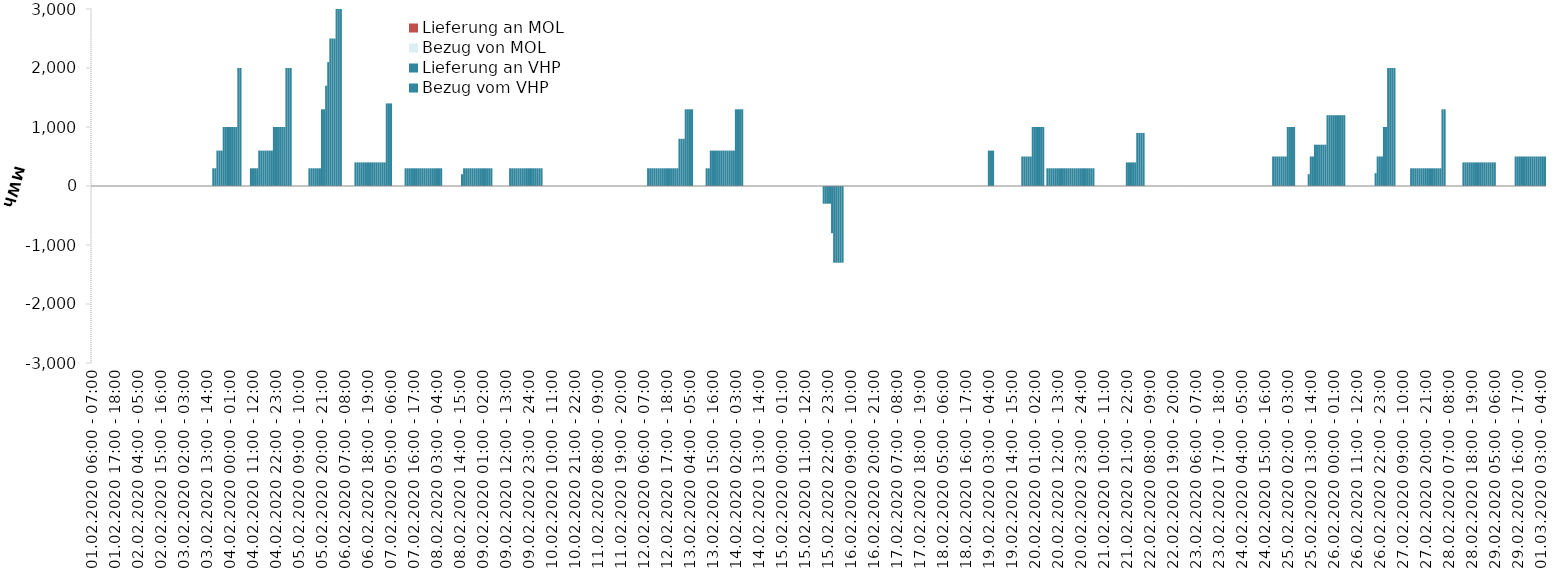
| Category | Bezug vom VHP | Lieferung an VHP | Bezug von MOL | Lieferung an MOL |
|---|---|---|---|---|
| 01.02.2020 06:00 - 07:00 | 0 | 0 | 0 | 0 |
| 01.02.2020 07:00 - 08:00 | 0 | 0 | 0 | 0 |
| 01.02.2020 08:00 - 09:00 | 0 | 0 | 0 | 0 |
| 01.02.2020 09:00 - 10:00 | 0 | 0 | 0 | 0 |
| 01.02.2020 10:00 - 11:00 | 0 | 0 | 0 | 0 |
| 01.02.2020 11:00 - 12:00 | 0 | 0 | 0 | 0 |
| 01.02.2020 12:00 - 13:00 | 0 | 0 | 0 | 0 |
| 01.02.2020 13:00 - 14:00 | 0 | 0 | 0 | 0 |
| 01.02.2020 14:00 - 15:00 | 0 | 0 | 0 | 0 |
| 01.02.2020 15:00 - 16:00 | 0 | 0 | 0 | 0 |
| 01.02.2020 16:00 - 17:00 | 0 | 0 | 0 | 0 |
| 01.02.2020 17:00 - 18:00 | 0 | 0 | 0 | 0 |
| 01.02.2020 18:00 - 19:00 | 0 | 0 | 0 | 0 |
| 01.02.2020 19:00 - 20:00 | 0 | 0 | 0 | 0 |
| 01.02.2020 20:00 - 21:00 | 0 | 0 | 0 | 0 |
| 01.02.2020 21:00 - 22:00 | 0 | 0 | 0 | 0 |
| 01.02.2020 22:00 - 23:00 | 0 | 0 | 0 | 0 |
| 01.02.2020 23:00 - 24:00 | 0 | 0 | 0 | 0 |
| 02.02.2020 00:00 - 01:00 | 0 | 0 | 0 | 0 |
| 02.02.2020 01:00 - 02:00 | 0 | 0 | 0 | 0 |
| 02.02.2020 02:00 - 03:00 | 0 | 0 | 0 | 0 |
| 02.02.2020 03:00 - 04:00 | 0 | 0 | 0 | 0 |
| 02.02.2020 04:00 - 05:00 | 0 | 0 | 0 | 0 |
| 02.02.2020 05:00 - 06:00 | 0 | 0 | 0 | 0 |
| 02.02.2020 06:00 - 07:00 | 0 | 0 | 0 | 0 |
| 02.02.2020 07:00 - 08:00 | 0 | 0 | 0 | 0 |
| 02.02.2020 08:00 - 09:00 | 0 | 0 | 0 | 0 |
| 02.02.2020 09:00 - 10:00 | 0 | 0 | 0 | 0 |
| 02.02.2020 10:00 - 11:00 | 0 | 0 | 0 | 0 |
| 02.02.2020 11:00 - 12:00 | 0 | 0 | 0 | 0 |
| 02.02.2020 12:00 - 13:00 | 0 | 0 | 0 | 0 |
| 02.02.2020 13:00 - 14:00 | 0 | 0 | 0 | 0 |
| 02.02.2020 14:00 - 15:00 | 0 | 0 | 0 | 0 |
| 02.02.2020 15:00 - 16:00 | 0 | 0 | 0 | 0 |
| 02.02.2020 16:00 - 17:00 | 0 | 0 | 0 | 0 |
| 02.02.2020 17:00 - 18:00 | 0 | 0 | 0 | 0 |
| 02.02.2020 18:00 - 19:00 | 0 | 0 | 0 | 0 |
| 02.02.2020 19:00 - 20:00 | 0 | 0 | 0 | 0 |
| 02.02.2020 20:00 - 21:00 | 0 | 0 | 0 | 0 |
| 02.02.2020 21:00 - 22:00 | 0 | 0 | 0 | 0 |
| 02.02.2020 22:00 - 23:00 | 0 | 0 | 0 | 0 |
| 02.02.2020 23:00 - 24:00 | 0 | 0 | 0 | 0 |
| 03.02.2020 00:00 - 01:00 | 0 | 0 | 0 | 0 |
| 03.02.2020 01:00 - 02:00 | 0 | 0 | 0 | 0 |
| 03.02.2020 02:00 - 03:00 | 0 | 0 | 0 | 0 |
| 03.02.2020 03:00 - 04:00 | 0 | 0 | 0 | 0 |
| 03.02.2020 04:00 - 05:00 | 0 | 0 | 0 | 0 |
| 03.02.2020 05:00 - 06:00 | 0 | 0 | 0 | 0 |
| 03.02.2020 06:00 - 07:00 | 0 | 0 | 0 | 0 |
| 03.02.2020 07:00 - 08:00 | 0 | 0 | 0 | 0 |
| 03.02.2020 08:00 - 09:00 | 0 | 0 | 0 | 0 |
| 03.02.2020 09:00 - 10:00 | 0 | 0 | 0 | 0 |
| 03.02.2020 10:00 - 11:00 | 0 | 0 | 0 | 0 |
| 03.02.2020 11:00 - 12:00 | 0 | 0 | 0 | 0 |
| 03.02.2020 12:00 - 13:00 | 0 | 0 | 0 | 0 |
| 03.02.2020 13:00 - 14:00 | 0 | 0 | 0 | 0 |
| 03.02.2020 14:00 - 15:00 | 0 | 0 | 0 | 0 |
| 03.02.2020 15:00 - 16:00 | 0 | 0 | 0 | 0 |
| 03.02.2020 16:00 - 17:00 | 300 | 0 | 0 | 0 |
| 03.02.2020 17:00 - 18:00 | 300 | 0 | 0 | 0 |
| 03.02.2020 18:00 - 19:00 | 600 | 0 | 0 | 0 |
| 03.02.2020 19:00 - 20:00 | 600 | 0 | 0 | 0 |
| 03.02.2020 20:00 - 21:00 | 600 | 0 | 0 | 0 |
| 03.02.2020 21:00 - 22:00 | 1000 | 0 | 0 | 0 |
| 03.02.2020 22:00 - 23:00 | 1000 | 0 | 0 | 0 |
| 03.02.2020 23:00 - 24:00 | 1000 | 0 | 0 | 0 |
| 04.02.2020 00:00 - 01:00 | 1000 | 0 | 0 | 0 |
| 04.02.2020 01:00 - 02:00 | 1000 | 0 | 0 | 0 |
| 04.02.2020 02:00 - 03:00 | 1000 | 0 | 0 | 0 |
| 04.02.2020 03:00 - 04:00 | 1000 | 0 | 0 | 0 |
| 04.02.2020 04:00 - 05:00 | 2000 | 0 | 0 | 0 |
| 04.02.2020 05:00 - 06:00 | 2000 | 0 | 0 | 0 |
| 04.02.2020 06:00 - 07:00 | 0 | 0 | 0 | 0 |
| 04.02.2020 07:00 - 08:00 | 0 | 0 | 0 | 0 |
| 04.02.2020 08:00 - 09:00 | 0 | 0 | 0 | 0 |
| 04.02.2020 09:00 - 10:00 | 0 | 0 | 0 | 0 |
| 04.02.2020 10:00 - 11:00 | 300 | 0 | 0 | 0 |
| 04.02.2020 11:00 - 12:00 | 300 | 0 | 0 | 0 |
| 04.02.2020 12:00 - 13:00 | 300 | 0 | 0 | 0 |
| 04.02.2020 13:00 - 14:00 | 300 | 0 | 0 | 0 |
| 04.02.2020 14:00 - 15:00 | 600 | 0 | 0 | 0 |
| 04.02.2020 15:00 - 16:00 | 600 | 0 | 0 | 0 |
| 04.02.2020 16:00 - 17:00 | 600 | 0 | 0 | 0 |
| 04.02.2020 17:00 - 18:00 | 600 | 0 | 0 | 0 |
| 04.02.2020 18:00 - 19:00 | 600 | 0 | 0 | 0 |
| 04.02.2020 19:00 - 20:00 | 600 | 0 | 0 | 0 |
| 04.02.2020 20:00 - 21:00 | 600 | 0 | 0 | 0 |
| 04.02.2020 21:00 - 22:00 | 1000 | 0 | 0 | 0 |
| 04.02.2020 22:00 - 23:00 | 1000 | 0 | 0 | 0 |
| 04.02.2020 23:00 - 24:00 | 1000 | 0 | 0 | 0 |
| 05.02.2020 00:00 - 01:00 | 1000 | 0 | 0 | 0 |
| 05.02.2020 01:00 - 02:00 | 1000 | 0 | 0 | 0 |
| 05.02.2020 02:00 - 03:00 | 1000 | 0 | 0 | 0 |
| 05.02.2020 03:00 - 04:00 | 2000 | 0 | 0 | 0 |
| 05.02.2020 04:00 - 05:00 | 2000 | 0 | 0 | 0 |
| 05.02.2020 05:00 - 06:00 | 2000 | 0 | 0 | 0 |
| 05.02.2020 06:00 - 07:00 | 0 | 0 | 0 | 0 |
| 05.02.2020 07:00 - 08:00 | 0 | 0 | 0 | 0 |
| 05.02.2020 08:00 - 09:00 | 0 | 0 | 0 | 0 |
| 05.02.2020 09:00 - 10:00 | 0 | 0 | 0 | 0 |
| 05.02.2020 10:00 - 11:00 | 0 | 0 | 0 | 0 |
| 05.02.2020 11:00 - 12:00 | 0 | 0 | 0 | 0 |
| 05.02.2020 12:00 - 13:00 | 0 | 0 | 0 | 0 |
| 05.02.2020 13:00 - 14:00 | 0 | 0 | 0 | 0 |
| 05.02.2020 14:00 - 15:00 | 300 | 0 | 0 | 0 |
| 05.02.2020 15:00 - 16:00 | 300 | 0 | 0 | 0 |
| 05.02.2020 16:00 - 17:00 | 300 | 0 | 0 | 0 |
| 05.02.2020 17:00 - 18:00 | 300 | 0 | 0 | 0 |
| 05.02.2020 18:00 - 19:00 | 300 | 0 | 0 | 0 |
| 05.02.2020 19:00 - 20:00 | 300 | 0 | 0 | 0 |
| 05.02.2020 20:00 - 21:00 | 1300 | 0 | 0 | 0 |
| 05.02.2020 21:00 - 22:00 | 1300 | 0 | 0 | 0 |
| 05.02.2020 22:00 - 23:00 | 1700 | 0 | 0 | 0 |
| 05.02.2020 23:00 - 24:00 | 2100 | 0 | 0 | 0 |
| 06.02.2020 00:00 - 01:00 | 2500 | 0 | 0 | 0 |
| 06.02.2020 01:00 - 02:00 | 2500 | 0 | 0 | 0 |
| 06.02.2020 02:00 - 03:00 | 2500 | 0 | 0 | 0 |
| 06.02.2020 03:00 - 04:00 | 3500 | 0 | 0 | 0 |
| 06.02.2020 04:00 - 05:00 | 3500 | 0 | 0 | 0 |
| 06.02.2020 05:00 - 06:00 | 3500 | 0 | 0 | 0 |
| 06.02.2020 06:00 - 07:00 | 0 | 0 | 0 | 0 |
| 06.02.2020 07:00 - 08:00 | 0 | 0 | 0 | 0 |
| 06.02.2020 08:00 - 09:00 | 0 | 0 | 0 | 0 |
| 06.02.2020 09:00 - 10:00 | 0 | 0 | 0 | 0 |
| 06.02.2020 10:00 - 11:00 | 0 | 0 | 0 | 0 |
| 06.02.2020 11:00 - 12:00 | 0 | 0 | 0 | 0 |
| 06.02.2020 12:00 - 13:00 | 400 | 0 | 0 | 0 |
| 06.02.2020 13:00 - 14:00 | 400 | 0 | 0 | 0 |
| 06.02.2020 14:00 - 15:00 | 400 | 0 | 0 | 0 |
| 06.02.2020 15:00 - 16:00 | 400 | 0 | 0 | 0 |
| 06.02.2020 16:00 - 17:00 | 400 | 0 | 0 | 0 |
| 06.02.2020 17:00 - 18:00 | 400 | 0 | 0 | 0 |
| 06.02.2020 18:00 - 19:00 | 400 | 0 | 0 | 0 |
| 06.02.2020 19:00 - 20:00 | 400 | 0 | 0 | 0 |
| 06.02.2020 20:00 - 21:00 | 400 | 0 | 0 | 0 |
| 06.02.2020 21:00 - 22:00 | 400 | 0 | 0 | 0 |
| 06.02.2020 22:00 - 23:00 | 400 | 0 | 0 | 0 |
| 06.02.2020 23:00 - 24:00 | 400 | 0 | 0 | 0 |
| 07.02.2020 00:00 - 01:00 | 400 | 0 | 0 | 0 |
| 07.02.2020 01:00 - 02:00 | 400 | 0 | 0 | 0 |
| 07.02.2020 02:00 - 03:00 | 400 | 0 | 0 | 0 |
| 07.02.2020 03:00 - 04:00 | 1400 | 0 | 0 | 0 |
| 07.02.2020 04:00 - 05:00 | 1400 | 0 | 0 | 0 |
| 07.02.2020 05:00 - 06:00 | 1400 | 0 | 0 | 0 |
| 07.02.2020 06:00 - 07:00 | 0 | 0 | 0 | 0 |
| 07.02.2020 07:00 - 08:00 | 0 | 0 | 0 | 0 |
| 07.02.2020 08:00 - 09:00 | 0 | 0 | 0 | 0 |
| 07.02.2020 09:00 - 10:00 | 0 | 0 | 0 | 0 |
| 07.02.2020 10:00 - 11:00 | 0 | 0 | 0 | 0 |
| 07.02.2020 11:00 - 12:00 | 0 | 0 | 0 | 0 |
| 07.02.2020 12:00 - 13:00 | 300 | 0 | 0 | 0 |
| 07.02.2020 13:00 - 14:00 | 300 | 0 | 0 | 0 |
| 07.02.2020 14:00 - 15:00 | 300 | 0 | 0 | 0 |
| 07.02.2020 15:00 - 16:00 | 300 | 0 | 0 | 0 |
| 07.02.2020 16:00 - 17:00 | 300 | 0 | 0 | 0 |
| 07.02.2020 17:00 - 18:00 | 300 | 0 | 0 | 0 |
| 07.02.2020 18:00 - 19:00 | 300 | 0 | 0 | 0 |
| 07.02.2020 19:00 - 20:00 | 300 | 0 | 0 | 0 |
| 07.02.2020 20:00 - 21:00 | 300 | 0 | 0 | 0 |
| 07.02.2020 21:00 - 22:00 | 300 | 0 | 0 | 0 |
| 07.02.2020 22:00 - 23:00 | 300 | 0 | 0 | 0 |
| 07.02.2020 23:00 - 24:00 | 300 | 0 | 0 | 0 |
| 08.02.2020 00:00 - 01:00 | 300 | 0 | 0 | 0 |
| 08.02.2020 01:00 - 02:00 | 300 | 0 | 0 | 0 |
| 08.02.2020 02:00 - 03:00 | 300 | 0 | 0 | 0 |
| 08.02.2020 03:00 - 04:00 | 300 | 0 | 0 | 0 |
| 08.02.2020 04:00 - 05:00 | 300 | 0 | 0 | 0 |
| 08.02.2020 05:00 - 06:00 | 300 | 0 | 0 | 0 |
| 08.02.2020 06:00 - 07:00 | 0 | 0 | 0 | 0 |
| 08.02.2020 07:00 - 08:00 | 0 | 0 | 0 | 0 |
| 08.02.2020 08:00 - 09:00 | 0 | 0 | 0 | 0 |
| 08.02.2020 09:00 - 10:00 | 0 | 0 | 0 | 0 |
| 08.02.2020 10:00 - 11:00 | 0 | 0 | 0 | 0 |
| 08.02.2020 11:00 - 12:00 | 0 | 0 | 0 | 0 |
| 08.02.2020 12:00 - 13:00 | 0 | 0 | 0 | 0 |
| 08.02.2020 13:00 - 14:00 | 0 | 0 | 0 | 0 |
| 08.02.2020 14:00 - 15:00 | 0 | 0 | 0 | 0 |
| 08.02.2020 15:00 - 16:00 | 200 | 0 | 0 | 0 |
| 08.02.2020 16:00 - 17:00 | 300 | 0 | 0 | 0 |
| 08.02.2020 17:00 - 18:00 | 300 | 0 | 0 | 0 |
| 08.02.2020 18:00 - 19:00 | 300 | 0 | 0 | 0 |
| 08.02.2020 19:00 - 20:00 | 300 | 0 | 0 | 0 |
| 08.02.2020 20:00 - 21:00 | 300 | 0 | 0 | 0 |
| 08.02.2020 21:00 - 22:00 | 300 | 0 | 0 | 0 |
| 08.02.2020 22:00 - 23:00 | 300 | 0 | 0 | 0 |
| 08.02.2020 23:00 - 24:00 | 300 | 0 | 0 | 0 |
| 09.02.2020 00:00 - 01:00 | 300 | 0 | 0 | 0 |
| 09.02.2020 01:00 - 02:00 | 300 | 0 | 0 | 0 |
| 09.02.2020 02:00 - 03:00 | 300 | 0 | 0 | 0 |
| 09.02.2020 03:00 - 04:00 | 300 | 0 | 0 | 0 |
| 09.02.2020 04:00 - 05:00 | 300 | 0 | 0 | 0 |
| 09.02.2020 05:00 - 06:00 | 300 | 0 | 0 | 0 |
| 09.02.2020 06:00 - 07:00 | 0 | 0 | 0 | 0 |
| 09.02.2020 07:00 - 08:00 | 0 | 0 | 0 | 0 |
| 09.02.2020 08:00 - 09:00 | 0 | 0 | 0 | 0 |
| 09.02.2020 09:00 - 10:00 | 0 | 0 | 0 | 0 |
| 09.02.2020 10:00 - 11:00 | 0 | 0 | 0 | 0 |
| 09.02.2020 11:00 - 12:00 | 0 | 0 | 0 | 0 |
| 09.02.2020 12:00 - 13:00 | 0 | 0 | 0 | 0 |
| 09.02.2020 13:00 - 14:00 | 0 | 0 | 0 | 0 |
| 09.02.2020 14:00 - 15:00 | 300 | 0 | 0 | 0 |
| 09.02.2020 15:00 - 16:00 | 300 | 0 | 0 | 0 |
| 09.02.2020 16:00 - 17:00 | 300 | 0 | 0 | 0 |
| 09.02.2020 17:00 - 18:00 | 300 | 0 | 0 | 0 |
| 09.02.2020 18:00 - 19:00 | 300 | 0 | 0 | 0 |
| 09.02.2020 19:00 - 20:00 | 300 | 0 | 0 | 0 |
| 09.02.2020 20:00 - 21:00 | 300 | 0 | 0 | 0 |
| 09.02.2020 21:00 - 22:00 | 300 | 0 | 0 | 0 |
| 09.02.2020 22:00 - 23:00 | 300 | 0 | 0 | 0 |
| 09.02.2020 23:00 - 24:00 | 300 | 0 | 0 | 0 |
| 10.02.2020 00:00 - 01:00 | 300 | 0 | 0 | 0 |
| 10.02.2020 01:00 - 02:00 | 300 | 0 | 0 | 0 |
| 10.02.2020 02:00 - 03:00 | 300 | 0 | 0 | 0 |
| 10.02.2020 03:00 - 04:00 | 300 | 0 | 0 | 0 |
| 10.02.2020 04:00 - 05:00 | 300 | 0 | 0 | 0 |
| 10.02.2020 05:00 - 06:00 | 300 | 0 | 0 | 0 |
| 10.02.2020 06:00 - 07:00 | 0 | 0 | 0 | 0 |
| 10.02.2020 07:00 - 08:00 | 0 | 0 | 0 | 0 |
| 10.02.2020 08:00 - 09:00 | 0 | 0 | 0 | 0 |
| 10.02.2020 09:00 - 10:00 | 0 | 0 | 0 | 0 |
| 10.02.2020 10:00 - 11:00 | 0 | 0 | 0 | 0 |
| 10.02.2020 11:00 - 12:00 | 0 | 0 | 0 | 0 |
| 10.02.2020 12:00 - 13:00 | 0 | 0 | 0 | 0 |
| 10.02.2020 13:00 - 14:00 | 0 | 0 | 0 | 0 |
| 10.02.2020 14:00 - 15:00 | 0 | 0 | 0 | 0 |
| 10.02.2020 15:00 - 16:00 | 0 | 0 | 0 | 0 |
| 10.02.2020 16:00 - 17:00 | 0 | 0 | 0 | 0 |
| 10.02.2020 17:00 - 18:00 | 0 | 0 | 0 | 0 |
| 10.02.2020 18:00 - 19:00 | 0 | 0 | 0 | 0 |
| 10.02.2020 19:00 - 20:00 | 0 | 0 | 0 | 0 |
| 10.02.2020 20:00 - 21:00 | 0 | 0 | 0 | 0 |
| 10.02.2020 21:00 - 22:00 | 0 | 0 | 0 | 0 |
| 10.02.2020 22:00 - 23:00 | 0 | 0 | 0 | 0 |
| 10.02.2020 23:00 - 24:00 | 0 | 0 | 0 | 0 |
| 11.02.2020 00:00 - 01:00 | 0 | 0 | 0 | 0 |
| 11.02.2020 01:00 - 02:00 | 0 | 0 | 0 | 0 |
| 11.02.2020 02:00 - 03:00 | 0 | 0 | 0 | 0 |
| 11.02.2020 03:00 - 04:00 | 0 | 0 | 0 | 0 |
| 11.02.2020 04:00 - 05:00 | 0 | 0 | 0 | 0 |
| 11.02.2020 05:00 - 06:00 | 0 | 0 | 0 | 0 |
| 11.02.2020 06:00 - 07:00 | 0 | 0 | 0 | 0 |
| 11.02.2020 07:00 - 08:00 | 0 | 0 | 0 | 0 |
| 11.02.2020 08:00 - 09:00 | 0 | 0 | 0 | 0 |
| 11.02.2020 09:00 - 10:00 | 0 | 0 | 0 | 0 |
| 11.02.2020 10:00 - 11:00 | 0 | 0 | 0 | 0 |
| 11.02.2020 11:00 - 12:00 | 0 | 0 | 0 | 0 |
| 11.02.2020 12:00 - 13:00 | 0 | 0 | 0 | 0 |
| 11.02.2020 13:00 - 14:00 | 0 | 0 | 0 | 0 |
| 11.02.2020 14:00 - 15:00 | 0 | 0 | 0 | 0 |
| 11.02.2020 15:00 - 16:00 | 0 | 0 | 0 | 0 |
| 11.02.2020 16:00 - 17:00 | 0 | 0 | 0 | 0 |
| 11.02.2020 17:00 - 18:00 | 0 | 0 | 0 | 0 |
| 11.02.2020 18:00 - 19:00 | 0 | 0 | 0 | 0 |
| 11.02.2020 19:00 - 20:00 | 0 | 0 | 0 | 0 |
| 11.02.2020 20:00 - 21:00 | 0 | 0 | 0 | 0 |
| 11.02.2020 21:00 - 22:00 | 0 | 0 | 0 | 0 |
| 11.02.2020 22:00 - 23:00 | 0 | 0 | 0 | 0 |
| 11.02.2020 23:00 - 24:00 | 0 | 0 | 0 | 0 |
| 12.02.2020 00:00 - 01:00 | 0 | 0 | 0 | 0 |
| 12.02.2020 01:00 - 02:00 | 0 | 0 | 0 | 0 |
| 12.02.2020 02:00 - 03:00 | 0 | 0 | 0 | 0 |
| 12.02.2020 03:00 - 04:00 | 0 | 0 | 0 | 0 |
| 12.02.2020 04:00 - 05:00 | 0 | 0 | 0 | 0 |
| 12.02.2020 05:00 - 06:00 | 0 | 0 | 0 | 0 |
| 12.02.2020 06:00 - 07:00 | 0 | 0 | 0 | 0 |
| 12.02.2020 07:00 - 08:00 | 0 | 0 | 0 | 0 |
| 12.02.2020 08:00 - 09:00 | 300 | 0 | 0 | 0 |
| 12.02.2020 09:00 - 10:00 | 300 | 0 | 0 | 0 |
| 12.02.2020 10:00 - 11:00 | 300 | 0 | 0 | 0 |
| 12.02.2020 11:00 - 12:00 | 300 | 0 | 0 | 0 |
| 12.02.2020 12:00 - 13:00 | 300 | 0 | 0 | 0 |
| 12.02.2020 13:00 - 14:00 | 300 | 0 | 0 | 0 |
| 12.02.2020 14:00 - 15:00 | 300 | 0 | 0 | 0 |
| 12.02.2020 15:00 - 16:00 | 300 | 0 | 0 | 0 |
| 12.02.2020 16:00 - 17:00 | 300 | 0 | 0 | 0 |
| 12.02.2020 17:00 - 18:00 | 300 | 0 | 0 | 0 |
| 12.02.2020 18:00 - 19:00 | 300 | 0 | 0 | 0 |
| 12.02.2020 19:00 - 20:00 | 300 | 0 | 0 | 0 |
| 12.02.2020 20:00 - 21:00 | 300 | 0 | 0 | 0 |
| 12.02.2020 21:00 - 22:00 | 300 | 0 | 0 | 0 |
| 12.02.2020 22:00 - 23:00 | 300 | 0 | 0 | 0 |
| 12.02.2020 23:00 - 24:00 | 800 | 0 | 0 | 0 |
| 13.02.2020 00:00 - 01:00 | 800 | 0 | 0 | 0 |
| 13.02.2020 01:00 - 02:00 | 800 | 0 | 0 | 0 |
| 13.02.2020 02:00 - 03:00 | 1300 | 0 | 0 | 0 |
| 13.02.2020 03:00 - 04:00 | 1300 | 0 | 0 | 0 |
| 13.02.2020 04:00 - 05:00 | 1300 | 0 | 0 | 0 |
| 13.02.2020 05:00 - 06:00 | 1300 | 0 | 0 | 0 |
| 13.02.2020 06:00 - 07:00 | 0 | 0 | 0 | 0 |
| 13.02.2020 07:00 - 08:00 | 0 | 0 | 0 | 0 |
| 13.02.2020 08:00 - 09:00 | 0 | 0 | 0 | 0 |
| 13.02.2020 09:00 - 10:00 | 0 | 0 | 0 | 0 |
| 13.02.2020 10:00 - 11:00 | 0 | 0 | 0 | 0 |
| 13.02.2020 11:00 - 12:00 | 0 | 0 | 0 | 0 |
| 13.02.2020 12:00 - 13:00 | 300 | 0 | 0 | 0 |
| 13.02.2020 13:00 - 14:00 | 300 | 0 | 0 | 0 |
| 13.02.2020 14:00 - 15:00 | 600 | 0 | 0 | 0 |
| 13.02.2020 15:00 - 16:00 | 600 | 0 | 0 | 0 |
| 13.02.2020 16:00 - 17:00 | 600 | 0 | 0 | 0 |
| 13.02.2020 17:00 - 18:00 | 600 | 0 | 0 | 0 |
| 13.02.2020 18:00 - 19:00 | 600 | 0 | 0 | 0 |
| 13.02.2020 19:00 - 20:00 | 600 | 0 | 0 | 0 |
| 13.02.2020 20:00 - 21:00 | 600 | 0 | 0 | 0 |
| 13.02.2020 21:00 - 22:00 | 600 | 0 | 0 | 0 |
| 13.02.2020 22:00 - 23:00 | 600 | 0 | 0 | 0 |
| 13.02.2020 23:00 - 24:00 | 600 | 0 | 0 | 0 |
| 14.02.2020 00:00 - 01:00 | 600 | 0 | 0 | 0 |
| 14.02.2020 01:00 - 02:00 | 600 | 0 | 0 | 0 |
| 14.02.2020 02:00 - 03:00 | 1300 | 0 | 0 | 0 |
| 14.02.2020 03:00 - 04:00 | 1300 | 0 | 0 | 0 |
| 14.02.2020 04:00 - 05:00 | 1300 | 0 | 0 | 0 |
| 14.02.2020 05:00 - 06:00 | 1300 | 0 | 0 | 0 |
| 14.02.2020 06:00 - 07:00 | 0 | 0 | 0 | 0 |
| 14.02.2020 07:00 - 08:00 | 0 | 0 | 0 | 0 |
| 14.02.2020 08:00 - 09:00 | 0 | 0 | 0 | 0 |
| 14.02.2020 09:00 - 10:00 | 0 | 0 | 0 | 0 |
| 14.02.2020 10:00 - 11:00 | 0 | 0 | 0 | 0 |
| 14.02.2020 11:00 - 12:00 | 0 | 0 | 0 | 0 |
| 14.02.2020 12:00 - 13:00 | 0 | 0 | 0 | 0 |
| 14.02.2020 13:00 - 14:00 | 0 | 0 | 0 | 0 |
| 14.02.2020 14:00 - 15:00 | 0 | 0 | 0 | 0 |
| 14.02.2020 15:00 - 16:00 | 0 | 0 | 0 | 0 |
| 14.02.2020 16:00 - 17:00 | 0 | 0 | 0 | 0 |
| 14.02.2020 17:00 - 18:00 | 0 | 0 | 0 | 0 |
| 14.02.2020 18:00 - 19:00 | 0 | 0 | 0 | 0 |
| 14.02.2020 19:00 - 20:00 | 0 | 0 | 0 | 0 |
| 14.02.2020 20:00 - 21:00 | 0 | 0 | 0 | 0 |
| 14.02.2020 21:00 - 22:00 | 0 | 0 | 0 | 0 |
| 14.02.2020 22:00 - 23:00 | 0 | 0 | 0 | 0 |
| 14.02.2020 23:00 - 24:00 | 0 | 0 | 0 | 0 |
| 15.02.2020 00:00 - 01:00 | 0 | 0 | 0 | 0 |
| 15.02.2020 01:00 - 02:00 | 0 | 0 | 0 | 0 |
| 15.02.2020 02:00 - 03:00 | 0 | 0 | 0 | 0 |
| 15.02.2020 03:00 - 04:00 | 0 | 0 | 0 | 0 |
| 15.02.2020 04:00 - 05:00 | 0 | 0 | 0 | 0 |
| 15.02.2020 05:00 - 06:00 | 0 | 0 | 0 | 0 |
| 15.02.2020 06:00 - 07:00 | 0 | 0 | 0 | 0 |
| 15.02.2020 07:00 - 08:00 | 0 | 0 | 0 | 0 |
| 15.02.2020 08:00 - 09:00 | 0 | 0 | 0 | 0 |
| 15.02.2020 09:00 - 10:00 | 0 | 0 | 0 | 0 |
| 15.02.2020 10:00 - 11:00 | 0 | 0 | 0 | 0 |
| 15.02.2020 11:00 - 12:00 | 0 | 0 | 0 | 0 |
| 15.02.2020 12:00 - 13:00 | 0 | 0 | 0 | 0 |
| 15.02.2020 13:00 - 14:00 | 0 | 0 | 0 | 0 |
| 15.02.2020 14:00 - 15:00 | 0 | 0 | 0 | 0 |
| 15.02.2020 15:00 - 16:00 | 0 | 0 | 0 | 0 |
| 15.02.2020 16:00 - 17:00 | 0 | 0 | 0 | 0 |
| 15.02.2020 17:00 - 18:00 | 0 | 0 | 0 | 0 |
| 15.02.2020 18:00 - 19:00 | 0 | 0 | 0 | 0 |
| 15.02.2020 19:00 - 20:00 | 0 | 0 | 0 | 0 |
| 15.02.2020 20:00 - 21:00 | 0 | -300 | 0 | 0 |
| 15.02.2020 21:00 - 22:00 | 0 | -300 | 0 | 0 |
| 15.02.2020 22:00 - 23:00 | 0 | -300 | 0 | 0 |
| 15.02.2020 23:00 - 24:00 | 0 | -300 | 0 | 0 |
| 16.02.2020 00:00 - 01:00 | 0 | -800 | 0 | 0 |
| 16.02.2020 01:00 - 02:00 | 0 | -1300 | 0 | 0 |
| 16.02.2020 02:00 - 03:00 | 0 | -1300 | 0 | 0 |
| 16.02.2020 03:00 - 04:00 | 0 | -1300 | 0 | 0 |
| 16.02.2020 04:00 - 05:00 | 0 | -1300 | 0 | 0 |
| 16.02.2020 05:00 - 06:00 | 0 | -1300 | 0 | 0 |
| 16.02.2020 06:00 - 07:00 | 0 | 0 | 0 | 0 |
| 16.02.2020 07:00 - 08:00 | 0 | 0 | 0 | 0 |
| 16.02.2020 08:00 - 09:00 | 0 | 0 | 0 | 0 |
| 16.02.2020 09:00 - 10:00 | 0 | 0 | 0 | 0 |
| 16.02.2020 10:00 - 11:00 | 0 | 0 | 0 | 0 |
| 16.02.2020 11:00 - 12:00 | 0 | 0 | 0 | 0 |
| 16.02.2020 12:00 - 13:00 | 0 | 0 | 0 | 0 |
| 16.02.2020 13:00 - 14:00 | 0 | 0 | 0 | 0 |
| 16.02.2020 14:00 - 15:00 | 0 | 0 | 0 | 0 |
| 16.02.2020 15:00 - 16:00 | 0 | 0 | 0 | 0 |
| 16.02.2020 16:00 - 17:00 | 0 | 0 | 0 | 0 |
| 16.02.2020 17:00 - 18:00 | 0 | 0 | 0 | 0 |
| 16.02.2020 18:00 - 19:00 | 0 | 0 | 0 | 0 |
| 16.02.2020 19:00 - 20:00 | 0 | 0 | 0 | 0 |
| 16.02.2020 20:00 - 21:00 | 0 | 0 | 0 | 0 |
| 16.02.2020 21:00 - 22:00 | 0 | 0 | 0 | 0 |
| 16.02.2020 22:00 - 23:00 | 0 | 0 | 0 | 0 |
| 16.02.2020 23:00 - 24:00 | 0 | 0 | 0 | 0 |
| 17.02.2020 00:00 - 01:00 | 0 | 0 | 0 | 0 |
| 17.02.2020 01:00 - 02:00 | 0 | 0 | 0 | 0 |
| 17.02.2020 02:00 - 03:00 | 0 | 0 | 0 | 0 |
| 17.02.2020 03:00 - 04:00 | 0 | 0 | 0 | 0 |
| 17.02.2020 04:00 - 05:00 | 0 | 0 | 0 | 0 |
| 17.02.2020 05:00 - 06:00 | 0 | 0 | 0 | 0 |
| 17.02.2020 06:00 - 07:00 | 0 | 0 | 0 | 0 |
| 17.02.2020 07:00 - 08:00 | 0 | 0 | 0 | 0 |
| 17.02.2020 08:00 - 09:00 | 0 | 0 | 0 | 0 |
| 17.02.2020 09:00 - 10:00 | 0 | 0 | 0 | 0 |
| 17.02.2020 10:00 - 11:00 | 0 | 0 | 0 | 0 |
| 17.02.2020 11:00 - 12:00 | 0 | 0 | 0 | 0 |
| 17.02.2020 12:00 - 13:00 | 0 | 0 | 0 | 0 |
| 17.02.2020 13:00 - 14:00 | 0 | 0 | 0 | 0 |
| 17.02.2020 14:00 - 15:00 | 0 | 0 | 0 | 0 |
| 17.02.2020 15:00 - 16:00 | 0 | 0 | 0 | 0 |
| 17.02.2020 16:00 - 17:00 | 0 | 0 | 0 | 0 |
| 17.02.2020 17:00 - 18:00 | 0 | 0 | 0 | 0 |
| 17.02.2020 18:00 - 19:00 | 0 | 0 | 0 | 0 |
| 17.02.2020 19:00 - 20:00 | 0 | 0 | 0 | 0 |
| 17.02.2020 20:00 - 21:00 | 0 | 0 | 0 | 0 |
| 17.02.2020 21:00 - 22:00 | 0 | 0 | 0 | 0 |
| 17.02.2020 22:00 - 23:00 | 0 | 0 | 0 | 0 |
| 17.02.2020 23:00 - 24:00 | 0 | 0 | 0 | 0 |
| 18.02.2020 00:00 - 01:00 | 0 | 0 | 0 | 0 |
| 18.02.2020 01:00 - 02:00 | 0 | 0 | 0 | 0 |
| 18.02.2020 02:00 - 03:00 | 0 | 0 | 0 | 0 |
| 18.02.2020 03:00 - 04:00 | 0 | 0 | 0 | 0 |
| 18.02.2020 04:00 - 05:00 | 0 | 0 | 0 | 0 |
| 18.02.2020 05:00 - 06:00 | 0 | 0 | 0 | 0 |
| 18.02.2020 06:00 - 07:00 | 0 | 0 | 0 | 0 |
| 18.02.2020 07:00 - 08:00 | 0 | 0 | 0 | 0 |
| 18.02.2020 08:00 - 09:00 | 0 | 0 | 0 | 0 |
| 18.02.2020 09:00 - 10:00 | 0 | 0 | 0 | 0 |
| 18.02.2020 10:00 - 11:00 | 0 | 0 | 0 | 0 |
| 18.02.2020 11:00 - 12:00 | 0 | 0 | 0 | 0 |
| 18.02.2020 12:00 - 13:00 | 0 | 0 | 0 | 0 |
| 18.02.2020 13:00 - 14:00 | 0 | 0 | 0 | 0 |
| 18.02.2020 14:00 - 15:00 | 0 | 0 | 0 | 0 |
| 18.02.2020 15:00 - 16:00 | 0 | 0 | 0 | 0 |
| 18.02.2020 16:00 - 17:00 | 0 | 0 | 0 | 0 |
| 18.02.2020 17:00 - 18:00 | 0 | 0 | 0 | 0 |
| 18.02.2020 18:00 - 19:00 | 0 | 0 | 0 | 0 |
| 18.02.2020 19:00 - 20:00 | 0 | 0 | 0 | 0 |
| 18.02.2020 20:00 - 21:00 | 0 | 0 | 0 | 0 |
| 18.02.2020 21:00 - 22:00 | 0 | 0 | 0 | 0 |
| 18.02.2020 22:00 - 23:00 | 0 | 0 | 0 | 0 |
| 18.02.2020 23:00 - 24:00 | 0 | 0 | 0 | 0 |
| 19.02.2020 00:00 - 01:00 | 0 | 0 | 0 | 0 |
| 19.02.2020 01:00 - 02:00 | 0 | 0 | 0 | 0 |
| 19.02.2020 02:00 - 03:00 | 0 | 0 | 0 | 0 |
| 19.02.2020 03:00 - 04:00 | 600 | 0 | 0 | 0 |
| 19.02.2020 04:00 - 05:00 | 600 | 0 | 0 | 0 |
| 19.02.2020 05:00 - 06:00 | 600 | 0 | 0 | 0 |
| 19.02.2020 06:00 - 07:00 | 0 | 0 | 0 | 0 |
| 19.02.2020 07:00 - 08:00 | 0 | 0 | 0 | 0 |
| 19.02.2020 08:00 - 09:00 | 0 | 0 | 0 | 0 |
| 19.02.2020 09:00 - 10:00 | 0 | 0 | 0 | 0 |
| 19.02.2020 10:00 - 11:00 | 0 | 0 | 0 | 0 |
| 19.02.2020 11:00 - 12:00 | 0 | 0 | 0 | 0 |
| 19.02.2020 12:00 - 13:00 | 0 | 0 | 0 | 0 |
| 19.02.2020 13:00 - 14:00 | 0 | 0 | 0 | 0 |
| 19.02.2020 14:00 - 15:00 | 0 | 0 | 0 | 0 |
| 19.02.2020 15:00 - 16:00 | 0 | 0 | 0 | 0 |
| 19.02.2020 16:00 - 17:00 | 0 | 0 | 0 | 0 |
| 19.02.2020 17:00 - 18:00 | 0 | 0 | 0 | 0 |
| 19.02.2020 18:00 - 19:00 | 0 | 0 | 0 | 0 |
| 19.02.2020 19:00 - 20:00 | 500 | 0 | 0 | 0 |
| 19.02.2020 20:00 - 21:00 | 500 | 0 | 0 | 0 |
| 19.02.2020 21:00 - 22:00 | 500 | 0 | 0 | 0 |
| 19.02.2020 22:00 - 23:00 | 500 | 0 | 0 | 0 |
| 19.02.2020 23:00 - 24:00 | 500 | 0 | 0 | 0 |
| 20.02.2020 00:00 - 01:00 | 1000 | 0 | 0 | 0 |
| 20.02.2020 01:00 - 02:00 | 1000 | 0 | 0 | 0 |
| 20.02.2020 02:00 - 03:00 | 1000 | 0 | 0 | 0 |
| 20.02.2020 03:00 - 04:00 | 1000 | 0 | 0 | 0 |
| 20.02.2020 04:00 - 05:00 | 1000 | 0 | 0 | 0 |
| 20.02.2020 05:00 - 06:00 | 1000 | 0 | 0 | 0 |
| 20.02.2020 06:00 - 07:00 | 0 | 0 | 0 | 0 |
| 20.02.2020 07:00 - 08:00 | 300 | 0 | 0 | 0 |
| 20.02.2020 08:00 - 09:00 | 300 | 0 | 0 | 0 |
| 20.02.2020 09:00 - 10:00 | 300 | 0 | 0 | 0 |
| 20.02.2020 10:00 - 11:00 | 300 | 0 | 0 | 0 |
| 20.02.2020 11:00 - 12:00 | 300 | 0 | 0 | 0 |
| 20.02.2020 12:00 - 13:00 | 300 | 0 | 0 | 0 |
| 20.02.2020 13:00 - 14:00 | 300 | 0 | 0 | 0 |
| 20.02.2020 14:00 - 15:00 | 300 | 0 | 0 | 0 |
| 20.02.2020 15:00 - 16:00 | 300 | 0 | 0 | 0 |
| 20.02.2020 16:00 - 17:00 | 300 | 0 | 0 | 0 |
| 20.02.2020 17:00 - 18:00 | 300 | 0 | 0 | 0 |
| 20.02.2020 18:00 - 19:00 | 300 | 0 | 0 | 0 |
| 20.02.2020 19:00 - 20:00 | 300 | 0 | 0 | 0 |
| 20.02.2020 20:00 - 21:00 | 300 | 0 | 0 | 0 |
| 20.02.2020 21:00 - 22:00 | 300 | 0 | 0 | 0 |
| 20.02.2020 22:00 - 23:00 | 300 | 0 | 0 | 0 |
| 20.02.2020 23:00 - 24:00 | 300 | 0 | 0 | 0 |
| 21.02.2020 00:00 - 01:00 | 300 | 0 | 0 | 0 |
| 21.02.2020 01:00 - 02:00 | 300 | 0 | 0 | 0 |
| 21.02.2020 02:00 - 03:00 | 300 | 0 | 0 | 0 |
| 21.02.2020 03:00 - 04:00 | 300 | 0 | 0 | 0 |
| 21.02.2020 04:00 - 05:00 | 300 | 0 | 0 | 0 |
| 21.02.2020 05:00 - 06:00 | 300 | 0 | 0 | 0 |
| 21.02.2020 06:00 - 07:00 | 0 | 0 | 0 | 0 |
| 21.02.2020 07:00 - 08:00 | 0 | 0 | 0 | 0 |
| 21.02.2020 08:00 - 09:00 | 0 | 0 | 0 | 0 |
| 21.02.2020 09:00 - 10:00 | 0 | 0 | 0 | 0 |
| 21.02.2020 10:00 - 11:00 | 0 | 0 | 0 | 0 |
| 21.02.2020 11:00 - 12:00 | 0 | 0 | 0 | 0 |
| 21.02.2020 12:00 - 13:00 | 0 | 0 | 0 | 0 |
| 21.02.2020 13:00 - 14:00 | 0 | 0 | 0 | 0 |
| 21.02.2020 14:00 - 15:00 | 0 | 0 | 0 | 0 |
| 21.02.2020 15:00 - 16:00 | 0 | 0 | 0 | 0 |
| 21.02.2020 16:00 - 17:00 | 0 | 0 | 0 | 0 |
| 21.02.2020 17:00 - 18:00 | 0 | 0 | 0 | 0 |
| 21.02.2020 18:00 - 19:00 | 0 | 0 | 0 | 0 |
| 21.02.2020 19:00 - 20:00 | 0 | 0 | 0 | 0 |
| 21.02.2020 20:00 - 21:00 | 0 | 0 | 0 | 0 |
| 21.02.2020 21:00 - 22:00 | 400 | 0 | 0 | 0 |
| 21.02.2020 22:00 - 23:00 | 400 | 0 | 0 | 0 |
| 21.02.2020 23:00 - 24:00 | 400 | 0 | 0 | 0 |
| 22.02.2020 00:00 - 01:00 | 400 | 0 | 0 | 0 |
| 22.02.2020 01:00 - 02:00 | 400 | 0 | 0 | 0 |
| 22.02.2020 02:00 - 03:00 | 900 | 0 | 0 | 0 |
| 22.02.2020 03:00 - 04:00 | 900 | 0 | 0 | 0 |
| 22.02.2020 04:00 - 05:00 | 900 | 0 | 0 | 0 |
| 22.02.2020 05:00 - 06:00 | 900 | 0 | 0 | 0 |
| 22.02.2020 06:00 - 07:00 | 0 | 0 | 0 | 0 |
| 22.02.2020 07:00 - 08:00 | 0 | 0 | 0 | 0 |
| 22.02.2020 08:00 - 09:00 | 0 | 0 | 0 | 0 |
| 22.02.2020 09:00 - 10:00 | 0 | 0 | 0 | 0 |
| 22.02.2020 10:00 - 11:00 | 0 | 0 | 0 | 0 |
| 22.02.2020 11:00 - 12:00 | 0 | 0 | 0 | 0 |
| 22.02.2020 12:00 - 13:00 | 0 | 0 | 0 | 0 |
| 22.02.2020 13:00 - 14:00 | 0 | 0 | 0 | 0 |
| 22.02.2020 14:00 - 15:00 | 0 | 0 | 0 | 0 |
| 22.02.2020 15:00 - 16:00 | 0 | 0 | 0 | 0 |
| 22.02.2020 16:00 - 17:00 | 0 | 0 | 0 | 0 |
| 22.02.2020 17:00 - 18:00 | 0 | 0 | 0 | 0 |
| 22.02.2020 18:00 - 19:00 | 0 | 0 | 0 | 0 |
| 22.02.2020 19:00 - 20:00 | 0 | 0 | 0 | 0 |
| 22.02.2020 20:00 - 21:00 | 0 | 0 | 0 | 0 |
| 22.02.2020 21:00 - 22:00 | 0 | 0 | 0 | 0 |
| 22.02.2020 22:00 - 23:00 | 0 | 0 | 0 | 0 |
| 22.02.2020 23:00 - 24:00 | 0 | 0 | 0 | 0 |
| 23.02.2020 00:00 - 01:00 | 0 | 0 | 0 | 0 |
| 23.02.2020 01:00 - 02:00 | 0 | 0 | 0 | 0 |
| 23.02.2020 02:00 - 03:00 | 0 | 0 | 0 | 0 |
| 23.02.2020 03:00 - 04:00 | 0 | 0 | 0 | 0 |
| 23.02.2020 04:00 - 05:00 | 0 | 0 | 0 | 0 |
| 23.02.2020 05:00 - 06:00 | 0 | 0 | 0 | 0 |
| 23.02.2020 06:00 - 07:00 | 0 | 0 | 0 | 0 |
| 23.02.2020 07:00 - 08:00 | 0 | 0 | 0 | 0 |
| 23.02.2020 08:00 - 09:00 | 0 | 0 | 0 | 0 |
| 23.02.2020 09:00 - 10:00 | 0 | 0 | 0 | 0 |
| 23.02.2020 10:00 - 11:00 | 0 | 0 | 0 | 0 |
| 23.02.2020 11:00 - 12:00 | 0 | 0 | 0 | 0 |
| 23.02.2020 12:00 - 13:00 | 0 | 0 | 0 | 0 |
| 23.02.2020 13:00 - 14:00 | 0 | 0 | 0 | 0 |
| 23.02.2020 14:00 - 15:00 | 0 | 0 | 0 | 0 |
| 23.02.2020 15:00 - 16:00 | 0 | 0 | 0 | 0 |
| 23.02.2020 16:00 - 17:00 | 0 | 0 | 0 | 0 |
| 23.02.2020 17:00 - 18:00 | 0 | 0 | 0 | 0 |
| 23.02.2020 18:00 - 19:00 | 0 | 0 | 0 | 0 |
| 23.02.2020 19:00 - 20:00 | 0 | 0 | 0 | 0 |
| 23.02.2020 20:00 - 21:00 | 0 | 0 | 0 | 0 |
| 23.02.2020 21:00 - 22:00 | 0 | 0 | 0 | 0 |
| 23.02.2020 22:00 - 23:00 | 0 | 0 | 0 | 0 |
| 23.02.2020 23:00 - 24:00 | 0 | 0 | 0 | 0 |
| 24.02.2020 00:00 - 01:00 | 0 | 0 | 0 | 0 |
| 24.02.2020 01:00 - 02:00 | 0 | 0 | 0 | 0 |
| 24.02.2020 02:00 - 03:00 | 0 | 0 | 0 | 0 |
| 24.02.2020 03:00 - 04:00 | 0 | 0 | 0 | 0 |
| 24.02.2020 04:00 - 05:00 | 0 | 0 | 0 | 0 |
| 24.02.2020 05:00 - 06:00 | 0 | 0 | 0 | 0 |
| 24.02.2020 06:00 - 07:00 | 0 | 0 | 0 | 0 |
| 24.02.2020 07:00 - 08:00 | 0 | 0 | 0 | 0 |
| 24.02.2020 08:00 - 09:00 | 0 | 0 | 0 | 0 |
| 24.02.2020 09:00 - 10:00 | 0 | 0 | 0 | 0 |
| 24.02.2020 10:00 - 11:00 | 0 | 0 | 0 | 0 |
| 24.02.2020 11:00 - 12:00 | 0 | 0 | 0 | 0 |
| 24.02.2020 12:00 - 13:00 | 0 | 0 | 0 | 0 |
| 24.02.2020 13:00 - 14:00 | 0 | 0 | 0 | 0 |
| 24.02.2020 14:00 - 15:00 | 0 | 0 | 0 | 0 |
| 24.02.2020 15:00 - 16:00 | 0 | 0 | 0 | 0 |
| 24.02.2020 16:00 - 17:00 | 0 | 0 | 0 | 0 |
| 24.02.2020 17:00 - 18:00 | 0 | 0 | 0 | 0 |
| 24.02.2020 18:00 - 19:00 | 0 | 0 | 0 | 0 |
| 24.02.2020 19:00 - 20:00 | 500 | 0 | 0 | 0 |
| 24.02.2020 20:00 - 21:00 | 500 | 0 | 0 | 0 |
| 24.02.2020 21:00 - 22:00 | 500 | 0 | 0 | 0 |
| 24.02.2020 22:00 - 23:00 | 500 | 0 | 0 | 0 |
| 24.02.2020 23:00 - 24:00 | 500 | 0 | 0 | 0 |
| 25.02.2020 00:00 - 01:00 | 500 | 0 | 0 | 0 |
| 25.02.2020 01:00 - 02:00 | 500 | 0 | 0 | 0 |
| 25.02.2020 02:00 - 03:00 | 1000 | 0 | 0 | 0 |
| 25.02.2020 03:00 - 04:00 | 1000 | 0 | 0 | 0 |
| 25.02.2020 04:00 - 05:00 | 1000 | 0 | 0 | 0 |
| 25.02.2020 05:00 - 06:00 | 1000 | 0 | 0 | 0 |
| 25.02.2020 06:00 - 07:00 | 0 | 0 | 0 | 0 |
| 25.02.2020 07:00 - 08:00 | 0 | 0 | 0 | 0 |
| 25.02.2020 08:00 - 09:00 | 0 | 0 | 0 | 0 |
| 25.02.2020 09:00 - 10:00 | 0 | 0 | 0 | 0 |
| 25.02.2020 10:00 - 11:00 | 0 | 0 | 0 | 0 |
| 25.02.2020 11:00 - 12:00 | 0 | 0 | 0 | 0 |
| 25.02.2020 12:00 - 13:00 | 200 | 0 | 0 | 0 |
| 25.02.2020 13:00 - 14:00 | 500 | 0 | 0 | 0 |
| 25.02.2020 14:00 - 15:00 | 500 | 0 | 0 | 0 |
| 25.02.2020 15:00 - 16:00 | 700 | 0 | 0 | 0 |
| 25.02.2020 16:00 - 17:00 | 700 | 0 | 0 | 0 |
| 25.02.2020 17:00 - 18:00 | 700 | 0 | 0 | 0 |
| 25.02.2020 18:00 - 19:00 | 700 | 0 | 0 | 0 |
| 25.02.2020 19:00 - 20:00 | 700 | 0 | 0 | 0 |
| 25.02.2020 20:00 - 21:00 | 700 | 0 | 0 | 0 |
| 25.02.2020 21:00 - 22:00 | 1200 | 0 | 0 | 0 |
| 25.02.2020 22:00 - 23:00 | 1200 | 0 | 0 | 0 |
| 25.02.2020 23:00 - 24:00 | 1200 | 0 | 0 | 0 |
| 26.02.2020 00:00 - 01:00 | 1200 | 0 | 0 | 0 |
| 26.02.2020 01:00 - 02:00 | 1200 | 0 | 0 | 0 |
| 26.02.2020 02:00 - 03:00 | 1200 | 0 | 0 | 0 |
| 26.02.2020 03:00 - 04:00 | 1200 | 0 | 0 | 0 |
| 26.02.2020 04:00 - 05:00 | 1200 | 0 | 0 | 0 |
| 26.02.2020 05:00 - 06:00 | 1200 | 0 | 0 | 0 |
| 26.02.2020 06:00 - 07:00 | 0 | 0 | 0 | 0 |
| 26.02.2020 07:00 - 08:00 | 0 | 0 | 0 | 0 |
| 26.02.2020 08:00 - 09:00 | 0 | 0 | 0 | 0 |
| 26.02.2020 09:00 - 10:00 | 0 | 0 | 0 | 0 |
| 26.02.2020 10:00 - 11:00 | 0 | 0 | 0 | 0 |
| 26.02.2020 11:00 - 12:00 | 0 | 0 | 0 | 0 |
| 26.02.2020 12:00 - 13:00 | 0 | 0 | 0 | 0 |
| 26.02.2020 13:00 - 14:00 | 0 | 0 | 0 | 0 |
| 26.02.2020 14:00 - 15:00 | 0 | 0 | 0 | 0 |
| 26.02.2020 15:00 - 16:00 | 0 | 0 | 0 | 0 |
| 26.02.2020 16:00 - 17:00 | 0 | 0 | 0 | 0 |
| 26.02.2020 17:00 - 18:00 | 0 | 0 | 0 | 0 |
| 26.02.2020 18:00 - 19:00 | 0 | 0 | 0 | 0 |
| 26.02.2020 19:00 - 20:00 | 0 | 0 | 0 | 0 |
| 26.02.2020 20:00 - 21:00 | 218 | 0 | 0 | 0 |
| 26.02.2020 21:00 - 22:00 | 500 | 0 | 0 | 0 |
| 26.02.2020 22:00 - 23:00 | 500 | 0 | 0 | 0 |
| 26.02.2020 23:00 - 24:00 | 500 | 0 | 0 | 0 |
| 27.02.2020 00:00 - 01:00 | 1000 | 0 | 0 | 0 |
| 27.02.2020 01:00 - 02:00 | 1000 | 0 | 0 | 0 |
| 27.02.2020 02:00 - 03:00 | 2000 | 0 | 0 | 0 |
| 27.02.2020 03:00 - 04:00 | 2000 | 0 | 0 | 0 |
| 27.02.2020 04:00 - 05:00 | 2000 | 0 | 0 | 0 |
| 27.02.2020 05:00 - 06:00 | 2000 | 0 | 0 | 0 |
| 27.02.2020 06:00 - 07:00 | 0 | 0 | 0 | 0 |
| 27.02.2020 07:00 - 08:00 | 0 | 0 | 0 | 0 |
| 27.02.2020 08:00 - 09:00 | 0 | 0 | 0 | 0 |
| 27.02.2020 09:00 - 10:00 | 0 | 0 | 0 | 0 |
| 27.02.2020 10:00 - 11:00 | 0 | 0 | 0 | 0 |
| 27.02.2020 11:00 - 12:00 | 0 | 0 | 0 | 0 |
| 27.02.2020 12:00 - 13:00 | 0 | 0 | 0 | 0 |
| 27.02.2020 13:00 - 14:00 | 300 | 0 | 0 | 0 |
| 27.02.2020 14:00 - 15:00 | 300 | 0 | 0 | 0 |
| 27.02.2020 15:00 - 16:00 | 300 | 0 | 0 | 0 |
| 27.02.2020 16:00 - 17:00 | 300 | 0 | 0 | 0 |
| 27.02.2020 17:00 - 18:00 | 300 | 0 | 0 | 0 |
| 27.02.2020 18:00 - 19:00 | 300 | 0 | 0 | 0 |
| 27.02.2020 19:00 - 20:00 | 300 | 0 | 0 | 0 |
| 27.02.2020 20:00 - 21:00 | 300 | 0 | 0 | 0 |
| 27.02.2020 21:00 - 22:00 | 300 | 0 | 0 | 0 |
| 27.02.2020 22:00 - 23:00 | 300 | 0 | 0 | 0 |
| 27.02.2020 23:00 - 24:00 | 300 | 0 | 0 | 0 |
| 28.02.2020 00:00 - 01:00 | 300 | 0 | 0 | 0 |
| 28.02.2020 01:00 - 02:00 | 300 | 0 | 0 | 0 |
| 28.02.2020 02:00 - 03:00 | 300 | 0 | 0 | 0 |
| 28.02.2020 03:00 - 04:00 | 300 | 0 | 0 | 0 |
| 28.02.2020 04:00 - 05:00 | 1300 | 0 | 0 | 0 |
| 28.02.2020 05:00 - 06:00 | 1300 | 0 | 0 | 0 |
| 28.02.2020 06:00 - 07:00 | 0 | 0 | 0 | 0 |
| 28.02.2020 07:00 - 08:00 | 0 | 0 | 0 | 0 |
| 28.02.2020 08:00 - 09:00 | 0 | 0 | 0 | 0 |
| 28.02.2020 09:00 - 10:00 | 0 | 0 | 0 | 0 |
| 28.02.2020 10:00 - 11:00 | 0 | 0 | 0 | 0 |
| 28.02.2020 11:00 - 12:00 | 0 | 0 | 0 | 0 |
| 28.02.2020 12:00 - 13:00 | 0 | 0 | 0 | 0 |
| 28.02.2020 13:00 - 14:00 | 0 | 0 | 0 | 0 |
| 28.02.2020 14:00 - 15:00 | 400 | 0 | 0 | 0 |
| 28.02.2020 15:00 - 16:00 | 400 | 0 | 0 | 0 |
| 28.02.2020 16:00 - 17:00 | 400 | 0 | 0 | 0 |
| 28.02.2020 17:00 - 18:00 | 400 | 0 | 0 | 0 |
| 28.02.2020 18:00 - 19:00 | 400 | 0 | 0 | 0 |
| 28.02.2020 19:00 - 20:00 | 400 | 0 | 0 | 0 |
| 28.02.2020 20:00 - 21:00 | 400 | 0 | 0 | 0 |
| 28.02.2020 21:00 - 22:00 | 400 | 0 | 0 | 0 |
| 28.02.2020 22:00 - 23:00 | 400 | 0 | 0 | 0 |
| 28.02.2020 23:00 - 24:00 | 400 | 0 | 0 | 0 |
| 29.02.2020 00:00 - 01:00 | 400 | 0 | 0 | 0 |
| 29.02.2020 01:00 - 02:00 | 400 | 0 | 0 | 0 |
| 29.02.2020 02:00 - 03:00 | 400 | 0 | 0 | 0 |
| 29.02.2020 03:00 - 04:00 | 400 | 0 | 0 | 0 |
| 29.02.2020 04:00 - 05:00 | 400 | 0 | 0 | 0 |
| 29.02.2020 05:00 - 06:00 | 400 | 0 | 0 | 0 |
| 29.02.2020 06:00 - 07:00 | 0 | 0 | 0 | 0 |
| 29.02.2020 07:00 - 08:00 | 0 | 0 | 0 | 0 |
| 29.02.2020 08:00 - 09:00 | 0 | 0 | 0 | 0 |
| 29.02.2020 09:00 - 10:00 | 0 | 0 | 0 | 0 |
| 29.02.2020 10:00 - 11:00 | 0 | 0 | 0 | 0 |
| 29.02.2020 11:00 - 12:00 | 0 | 0 | 0 | 0 |
| 29.02.2020 12:00 - 13:00 | 0 | 0 | 0 | 0 |
| 29.02.2020 13:00 - 14:00 | 0 | 0 | 0 | 0 |
| 29.02.2020 14:00 - 15:00 | 0 | 0 | 0 | 0 |
| 29.02.2020 15:00 - 16:00 | 500 | 0 | 0 | 0 |
| 29.02.2020 16:00 - 17:00 | 500 | 0 | 0 | 0 |
| 29.02.2020 17:00 - 18:00 | 500 | 0 | 0 | 0 |
| 29.02.2020 18:00 - 19:00 | 500 | 0 | 0 | 0 |
| 29.02.2020 19:00 - 20:00 | 500 | 0 | 0 | 0 |
| 29.02.2020 20:00 - 21:00 | 500 | 0 | 0 | 0 |
| 29.02.2020 21:00 - 22:00 | 500 | 0 | 0 | 0 |
| 29.02.2020 22:00 - 23:00 | 500 | 0 | 0 | 0 |
| 29.02.2020 23:00 - 24:00 | 500 | 0 | 0 | 0 |
| 01.03.2020 00:00 - 01:00 | 500 | 0 | 0 | 0 |
| 01.03.2020 01:00 - 02:00 | 500 | 0 | 0 | 0 |
| 01.03.2020 02:00 - 03:00 | 500 | 0 | 0 | 0 |
| 01.03.2020 03:00 - 04:00 | 500 | 0 | 0 | 0 |
| 01.03.2020 04:00 - 05:00 | 500 | 0 | 0 | 0 |
| 01.03.2020 05:00 - 06:00 | 500 | 0 | 0 | 0 |